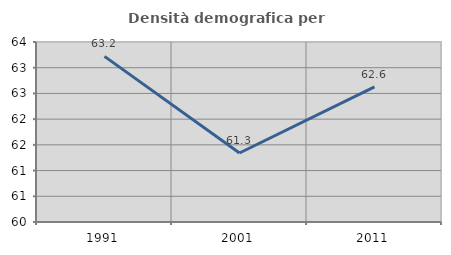
| Category | Densità demografica |
|---|---|
| 1991.0 | 63.221 |
| 2001.0 | 61.341 |
| 2011.0 | 62.627 |